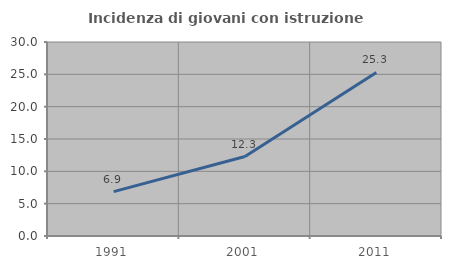
| Category | Incidenza di giovani con istruzione universitaria |
|---|---|
| 1991.0 | 6.856 |
| 2001.0 | 12.288 |
| 2011.0 | 25.295 |